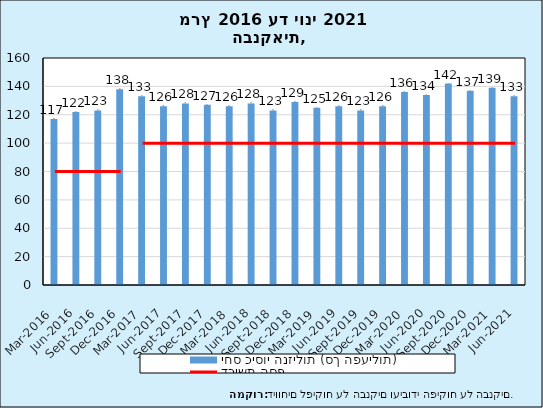
| Category | יחס כיסוי הנזילות (סך הפעילות) |
|---|---|
| 2016-03-31 | 117 |
| 2016-06-30 | 122 |
| 2016-09-30 | 123 |
| 2016-12-31 | 138 |
| 2017-03-31 | 133 |
| 2017-06-30 | 126 |
| 2017-09-30 | 128 |
| 2017-12-31 | 127 |
| 2018-03-31 | 126 |
| 2018-06-30 | 128 |
| 2018-09-30 | 123 |
| 2018-12-31 | 129 |
| 2019-03-31 | 125 |
| 2019-06-30 | 126 |
| 2019-09-30 | 123 |
| 2019-12-31 | 126 |
| 2020-03-31 | 136 |
| 2020-06-30 | 134 |
| 2020-09-30 | 142 |
| 2020-12-31 | 137 |
| 2021-03-31 | 139 |
| 2021-06-30 | 133 |